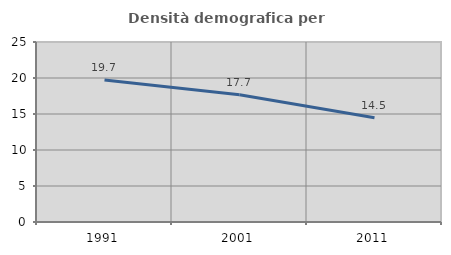
| Category | Densità demografica |
|---|---|
| 1991.0 | 19.735 |
| 2001.0 | 17.663 |
| 2011.0 | 14.489 |